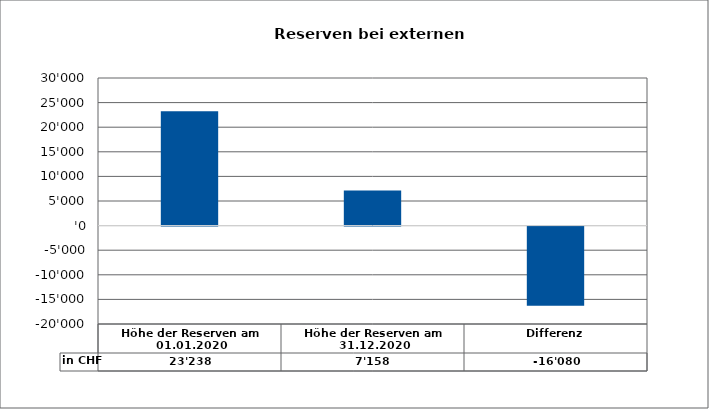
| Category | in CHF |
|---|---|
| Höhe der Reserven am 01.01.2020 | 23238 |
| Höhe der Reserven am 31.12.2020 | 7158 |
| Differenz | -16080 |